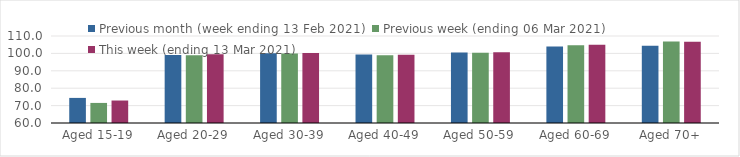
| Category | Previous month (week ending 13 Feb 2021) | Previous week (ending 06 Mar 2021) | This week (ending 13 Mar 2021) |
|---|---|---|---|
| Aged 15-19 | 74.42 | 71.54 | 72.92 |
| Aged 20-29 | 99.14 | 98.92 | 99.46 |
| Aged 30-39 | 100.06 | 99.96 | 100.21 |
| Aged 40-49 | 99.34 | 98.97 | 99.26 |
| Aged 50-59 | 100.54 | 100.36 | 100.71 |
| Aged 60-69 | 103.92 | 104.72 | 104.93 |
| Aged 70+ | 104.44 | 106.82 | 106.73 |